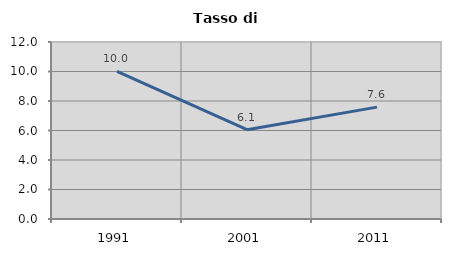
| Category | Tasso di disoccupazione   |
|---|---|
| 1991.0 | 10.01 |
| 2001.0 | 6.055 |
| 2011.0 | 7.584 |